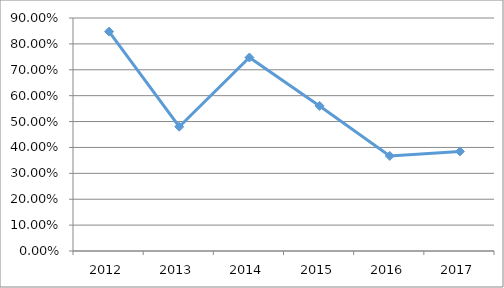
| Category | DIMA-M6O12 |
|---|---|
| 2012.0 | 0.847 |
| 2013.0 | 0.48 |
| 2014.0 | 0.747 |
| 2015.0 | 0.56 |
| 2016.0 | 0.367 |
| 2017.0 | 0.385 |